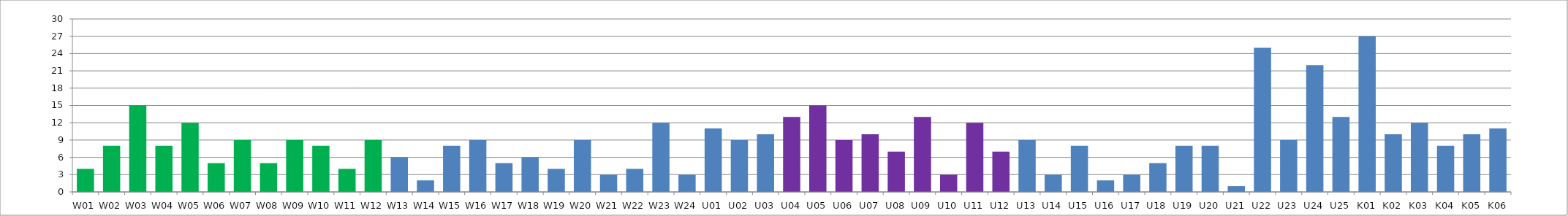
| Category | Series 0 |
|---|---|
| W01 | 4 |
| W02 | 8 |
| W03 | 15 |
| W04 | 8 |
| W05 | 12 |
| W06 | 5 |
| W07 | 9 |
| W08 | 5 |
| W09 | 9 |
| W10 | 8 |
| W11 | 4 |
| W12 | 9 |
| W13 | 6 |
| W14 | 2 |
| W15 | 8 |
| W16 | 9 |
| W17 | 5 |
| W18 | 6 |
| W19 | 4 |
| W20 | 9 |
| W21 | 3 |
| W22 | 4 |
| W23 | 12 |
| W24 | 3 |
| U01 | 11 |
| U02 | 9 |
| U03 | 10 |
| U04 | 13 |
| U05 | 15 |
| U06 | 9 |
| U07 | 10 |
| U08 | 7 |
| U09 | 13 |
| U10 | 3 |
| U11 | 12 |
| U12 | 7 |
| U13 | 9 |
| U14 | 3 |
| U15 | 8 |
| U16 | 2 |
| U17 | 3 |
| U18 | 5 |
| U19 | 8 |
| U20 | 8 |
| U21 | 1 |
| U22 | 25 |
| U23 | 9 |
| U24 | 22 |
| U25 | 13 |
| K01 | 27 |
| K02 | 10 |
| K03 | 12 |
| K04 | 8 |
| K05 | 10 |
| K06 | 11 |